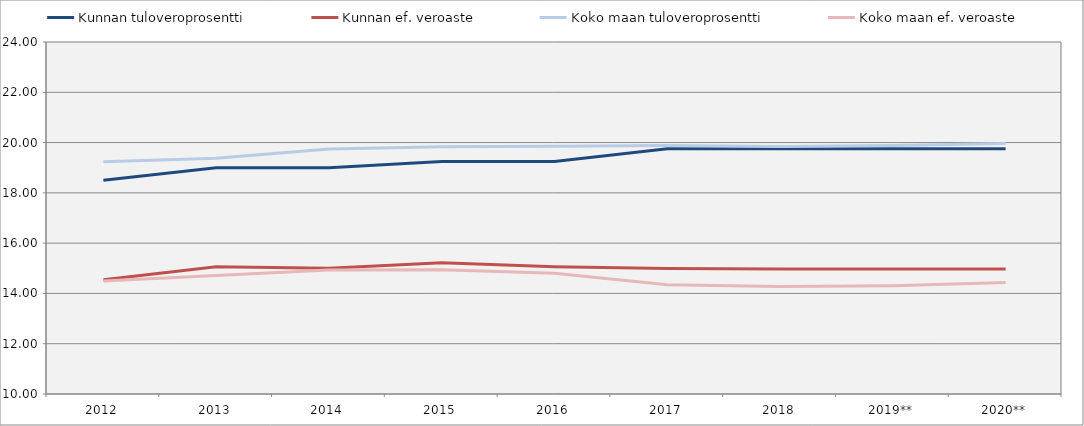
| Category | Kunnan tuloveroprosentti | Kunnan ef. veroaste | Koko maan tuloveroprosentti | Koko maan ef. veroaste |
|---|---|---|---|---|
| 2012 | 18.5 | 14.545 | 19.24 | 14.494 |
| 2013 | 19 | 15.064 | 19.38 | 14.71 |
| 2014 | 19 | 15.006 | 19.74 | 14.934 |
| 2015 | 19.25 | 15.22 | 19.83 | 14.944 |
| 2016 | 19.25 | 15.062 | 19.854 | 14.799 |
| 2017 | 19.75 | 14.992 | 19.886 | 14.346 |
| 2018 | 19.75 | 14.975 | 19.844 | 14.279 |
| 2019** | 19.75 | 14.975 | 19.88 | 14.305 |
| 2020** | 19.75 | 14.973 | 19.965 | 14.43 |